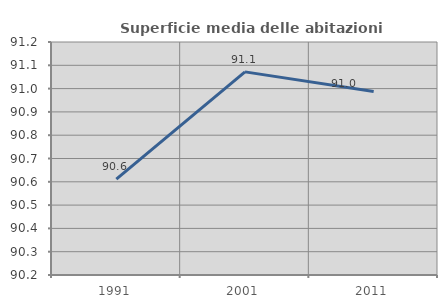
| Category | Superficie media delle abitazioni occupate |
|---|---|
| 1991.0 | 90.612 |
| 2001.0 | 91.072 |
| 2011.0 | 90.988 |